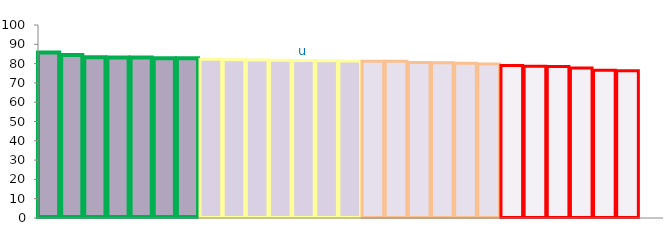
| Category | Top Quartile | 2nd Quartile | 3rd Quartile | Bottom Quartile | Series 4 |
|---|---|---|---|---|---|
|  | 85.8 | 0 | 0 | 0 | 85.8 |
|  | 84.446 | 0 | 0 | 0 | 84.446 |
|  | 83.26 | 0 | 0 | 0 | 83.26 |
|  | 83.165 | 0 | 0 | 0 | 83.165 |
|  | 83.164 | 0 | 0 | 0 | 83.164 |
|  | 82.776 | 0 | 0 | 0 | 82.776 |
|  | 82.724 | 0 | 0 | 0 | 82.724 |
|  | 0 | 82.218 | 0 | 0 | 82.218 |
|  | 0 | 82.024 | 0 | 0 | 82.024 |
|  | 0 | 81.915 | 0 | 0 | 81.915 |
|  | 0 | 81.691 | 0 | 0 | 81.691 |
| u | 0 | 81.645 | 0 | 0 | 81.645 |